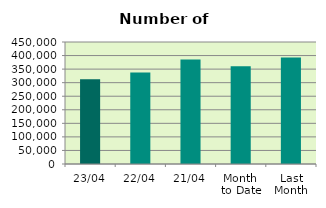
| Category | Series 0 |
|---|---|
| 23/04 | 312784 |
| 22/04 | 337462 |
| 21/04 | 385530 |
| Month 
to Date | 360194.571 |
| Last
Month | 392496.174 |